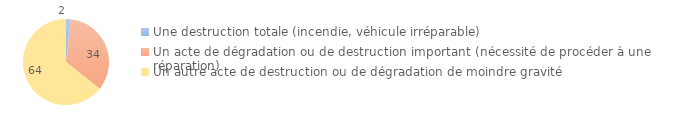
| Category | Series 0 |
|---|---|
| Une destruction totale (incendie, véhicule irréparable) | 1.783 |
| Un acte de dégradation ou de destruction important (nécessité de procéder à une réparation) | 33.895 |
| Un autre acte de destruction ou de dégradation de moindre gravité | 64.322 |